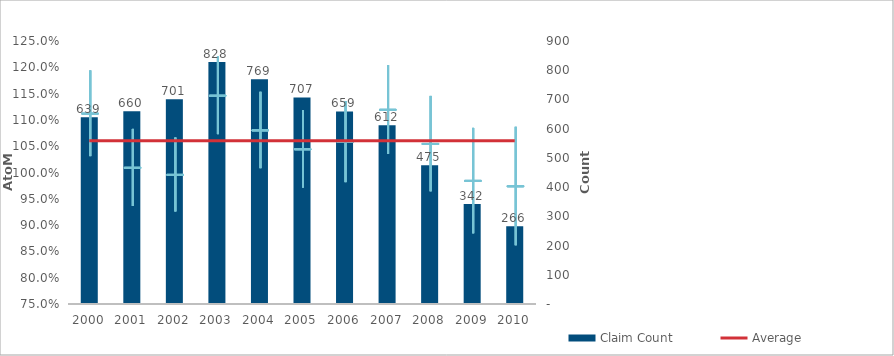
| Category | Claim Count |
|---|---|
| 0 | 639 |
| 1 | 660 |
| 2 | 701 |
| 3 | 828 |
| 4 | 769 |
| 5 | 707 |
| 6 | 659 |
| 7 | 612 |
| 8 | 475 |
| 9 | 342 |
| 10 | 266 |